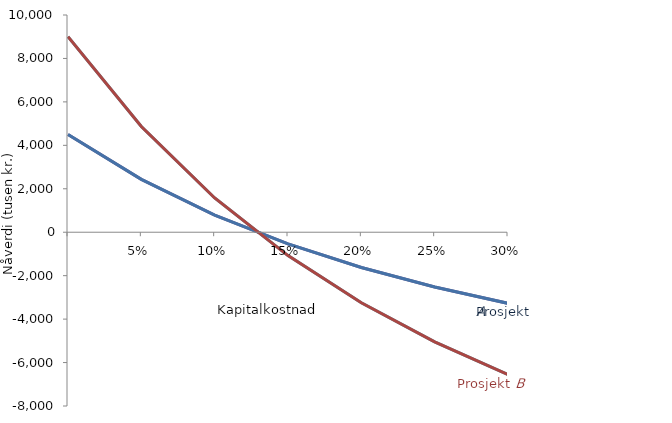
| Category | Nåverdi prosjekt A | Nåverdi prosjekt B | Series 5 | Series 2 |
|---|---|---|---|---|
| nan | 4500 | 9000 |  |  |
| 0.05 | 2432.569 | 4865.139 |  |  |
| 0.1 | 788.406 | 1576.813 |  |  |
| 0.15000000000000002 | -538.734 | -1077.468 |  |  |
| 0.2 | -1624.389 | -3248.778 |  |  |
| 0.25 | -2523.264 | -5046.528 |  |  |
| 0.3 | -3275.649 | -6551.297 |  |  |